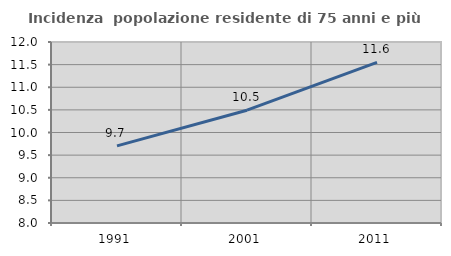
| Category | Incidenza  popolazione residente di 75 anni e più |
|---|---|
| 1991.0 | 9.704 |
| 2001.0 | 10.493 |
| 2011.0 | 11.551 |